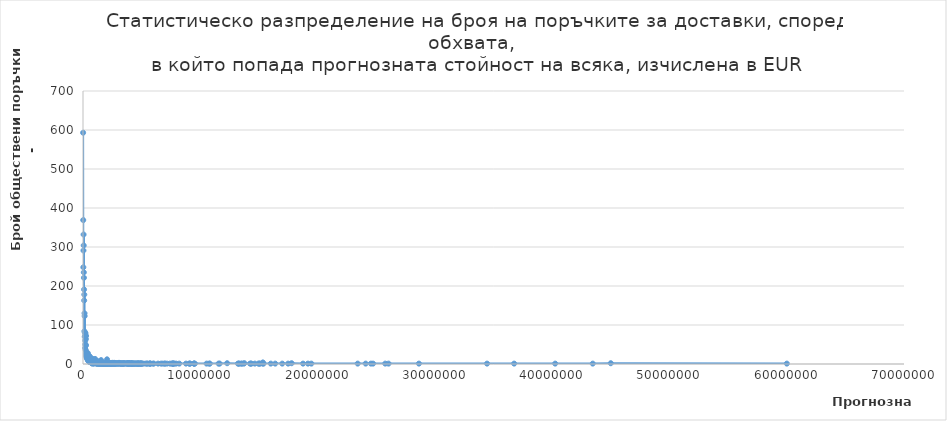
| Category | Series 0 |
|---|---|
| 10000.0 | 593 |
| 20000.0 | 369 |
| 30000.0 | 248 |
| 40000.0 | 291 |
| 50000.0 | 332 |
| 60000.0 | 304 |
| 70000.0 | 235 |
| 80000.0 | 221 |
| 90000.0 | 191 |
| 100000.0 | 163 |
| 110000.0 | 178 |
| 120000.0 | 84 |
| 130000.0 | 130 |
| 140000.0 | 123 |
| 150000.0 | 70 |
| 160000.0 | 80 |
| 170000.0 | 72 |
| 180000.0 | 41 |
| 190000.0 | 60 |
| 200000.0 | 51 |
| 210000.0 | 79 |
| 220000.0 | 48 |
| 230000.0 | 36 |
| 240000.0 | 64 |
| 250000.0 | 48 |
| 260000.0 | 72 |
| 270000.0 | 30 |
| 280000.0 | 22 |
| 290000.0 | 25 |
| 300000.0 | 17 |
| 310000.0 | 27 |
| 320000.0 | 18 |
| 330000.0 | 19 |
| 340000.0 | 20 |
| 350000.0 | 13 |
| 360000.0 | 27 |
| 370000.0 | 15 |
| 380000.0 | 17 |
| 390000.0 | 20 |
| 400000.0 | 15 |
| 410000.0 | 28 |
| 420000.0 | 18 |
| 430000.0 | 17 |
| 440000.0 | 17 |
| 450000.0 | 8 |
| 460000.0 | 8 |
| 470000.0 | 11 |
| 480000.0 | 8 |
| 490000.0 | 9 |
| 500000.0 | 10 |
| 510000.0 | 11 |
| 520000.0 | 17 |
| 530000.0 | 8 |
| 540000.0 | 12 |
| 550000.0 | 8 |
| 560000.0 | 5 |
| 570000.0 | 20 |
| 580000.0 | 6 |
| 590000.0 | 8 |
| 600000.0 | 5 |
| 610000.0 | 6 |
| 620000.0 | 11 |
| 630000.0 | 6 |
| 640000.0 | 10 |
| 650000.0 | 5 |
| 660000.0 | 5 |
| 670000.0 | 7 |
| 680000.0 | 5 |
| 690000.0 | 4 |
| 700000.0 | 10 |
| 710000.0 | 11 |
| 720000.0 | 7 |
| 730000.0 | 9 |
| 740000.0 | 2 |
| 750000.0 | 6 |
| 760000.0 | 4 |
| 770000.0 | 14 |
| 780000.0 | 4 |
| 790000.0 | 4 |
| 800000.0 | 12 |
| 810000.0 | 1 |
| 820000.0 | 5 |
| 830000.0 | 3 |
| 840000.0 | 6 |
| 850000.0 | 5 |
| 860000.0 | 4 |
| 870000.0 | 4 |
| 880000.0 | 2 |
| 890000.0 | 5 |
| 900000.0 | 6 |
| 910000.0 | 3 |
| 920000.0 | 1 |
| 930000.0 | 8 |
| 940000.0 | 4 |
| 950000.0 | 4 |
| 960000.0 | 3 |
| 970000.0 | 3 |
| 980000.0 | 5 |
| 990000.0 | 4 |
| 1000000.0 | 5 |
| 1010000.0 | 3 |
| 1020000.0 | 2 |
| 1030000.0 | 13 |
| 1040000.0 | 4 |
| 1060000.0 | 3 |
| 1070000.0 | 3 |
| 1080000.0 | 4 |
| 1090000.0 | 2 |
| 1100000.0 | 2 |
| 1110000.0 | 2 |
| 1120000.0 | 3 |
| 1130000.0 | 3 |
| 1140000.0 | 2 |
| 1150000.0 | 3 |
| 1160000.0 | 5 |
| 1190000.0 | 1 |
| 1200000.0 | 4 |
| 1210000.0 | 2 |
| 1220000.0 | 2 |
| 1230000.0 | 3 |
| 1240000.0 | 1 |
| 1250000.0 | 1 |
| 1270000.0 | 2 |
| 1280000.0 | 7 |
| 1290000.0 | 4 |
| 1310000.0 | 3 |
| 1330000.0 | 4 |
| 1340000.0 | 4 |
| 1350000.0 | 1 |
| 1360000.0 | 1 |
| 1390000.0 | 3 |
| 1400000.0 | 1 |
| 1410000.0 | 2 |
| 1420000.0 | 1 |
| 1440000.0 | 2 |
| 1450000.0 | 3 |
| 1470000.0 | 1 |
| 1490000.0 | 2 |
| 1500000.0 | 3 |
| 1510000.0 | 4 |
| 1520000.0 | 1 |
| 1540000.0 | 10 |
| 1560000.0 | 1 |
| 1580000.0 | 1 |
| 1590000.0 | 3 |
| 1600000.0 | 2 |
| 1610000.0 | 1 |
| 1630000.0 | 2 |
| 1650000.0 | 1 |
| 1660000.0 | 2 |
| 1670000.0 | 2 |
| 1680000.0 | 1 |
| 1690000.0 | 1 |
| 1700000.0 | 2 |
| 1720000.0 | 1 |
| 1730000.0 | 1 |
| 1740000.0 | 1 |
| 1760000.0 | 1 |
| 1770000.0 | 3 |
| 1780000.0 | 1 |
| 1810000.0 | 2 |
| 1820000.0 | 2 |
| 1840000.0 | 1 |
| 1850000.0 | 2 |
| 1860000.0 | 2 |
| 1880000.0 | 1 |
| 1890000.0 | 1 |
| 1900000.0 | 1 |
| 1910000.0 | 1 |
| 1920000.0 | 2 |
| 1970000.0 | 2 |
| 2000000.0 | 1 |
| 2010000.0 | 1 |
| 2040000.0 | 3 |
| 2050000.0 | 12 |
| 2060000.0 | 1 |
| 2070000.0 | 1 |
| 2080000.0 | 1 |
| 2100000.0 | 1 |
| 2120000.0 | 1 |
| 2140000.0 | 3 |
| 2180000.0 | 3 |
| 2200000.0 | 2 |
| 2220000.0 | 1 |
| 2240000.0 | 1 |
| 2260000.0 | 2 |
| 2280000.0 | 1 |
| 2290000.0 | 1 |
| 2310000.0 | 2 |
| 2320000.0 | 1 |
| 2340000.0 | 2 |
| 2360000.0 | 1 |
| 2380000.0 | 1 |
| 2390000.0 | 1 |
| 2400000.0 | 1 |
| 2420000.0 | 1 |
| 2430000.0 | 1 |
| 2460000.0 | 1 |
| 2470000.0 | 1 |
| 2490000.0 | 1 |
| 2500000.0 | 3 |
| 2560000.0 | 2 |
| 2570000.0 | 1 |
| 2580000.0 | 1 |
| 2590000.0 | 2 |
| 2600000.0 | 1 |
| 2620000.0 | 1 |
| 2660000.0 | 3 |
| 2670000.0 | 2 |
| 2690000.0 | 1 |
| 2700000.0 | 1 |
| 2750000.0 | 1 |
| 2770000.0 | 1 |
| 2820000.0 | 2 |
| 2840000.0 | 1 |
| 2860000.0 | 1 |
| 2930000.0 | 2 |
| 2970000.0 | 1 |
| 2980000.0 | 1 |
| 3070000.0 | 3 |
| 3080000.0 | 1 |
| 3110000.0 | 1 |
| 3180000.0 | 2 |
| 3210000.0 | 1 |
| 3230000.0 | 1 |
| 3240000.0 | 1 |
| 3260000.0 | 1 |
| 3300000.0 | 1 |
| 3320000.0 | 1 |
| 3330000.0 | 1 |
| 3390000.0 | 1 |
| 3400000.0 | 1 |
| 3410000.0 | 1 |
| 3420000.0 | 1 |
| 3470000.0 | 1 |
| 3480000.0 | 2 |
| 3490000.0 | 1 |
| 3530000.0 | 1 |
| 3600000.0 | 2 |
| 3690000.0 | 1 |
| 3720000.0 | 1 |
| 3760000.0 | 2 |
| 3800000.0 | 1 |
| 3820000.0 | 1 |
| 3840000.0 | 1 |
| 3860000.0 | 1 |
| 3870000.0 | 2 |
| 3900000.0 | 2 |
| 3910000.0 | 1 |
| 3920000.0 | 1 |
| 3950000.0 | 1 |
| 4000000.0 | 1 |
| 4040000.0 | 1 |
| 4060000.0 | 2 |
| 4120000.0 | 1 |
| 4130000.0 | 1 |
| 4140000.0 | 1 |
| 4160000.0 | 1 |
| 4170000.0 | 1 |
| 4180000.0 | 1 |
| 4200000.0 | 1 |
| 4210000.0 | 1 |
| 4280000.0 | 1 |
| 4320000.0 | 1 |
| 4330000.0 | 1 |
| 4350000.0 | 1 |
| 4410000.0 | 1 |
| 4490000.0 | 1 |
| 4500000.0 | 1 |
| 4510000.0 | 1 |
| 4610000.0 | 1 |
| 4640000.0 | 1 |
| 4670000.0 | 1 |
| 4690000.0 | 1 |
| 4700000.0 | 1 |
| 4740000.0 | 1 |
| 4760000.0 | 1 |
| 4820000.0 | 1 |
| 4860000.0 | 1 |
| 4890000.0 | 1 |
| 4930000.0 | 1 |
| 4950000.0 | 1 |
| 4960000.0 | 1 |
| 4990000.0 | 1 |
| 5050000.0 | 1 |
| 5120000.0 | 1 |
| 5320000.0 | 1 |
| 5450000.0 | 1 |
| 5490000.0 | 1 |
| 5670000.0 | 1 |
| 5700000.0 | 1 |
| 5730000.0 | 1 |
| 5760000.0 | 1 |
| 5970000.0 | 1 |
| 6040000.0 | 1 |
| 6400000.0 | 1 |
| 6650000.0 | 1 |
| 6790000.0 | 1 |
| 6970000.0 | 1 |
| 6980000.0 | 1 |
| 7160000.0 | 1 |
| 7410000.0 | 1 |
| 7570000.0 | 1 |
| 7620000.0 | 1 |
| 7670000.0 | 1 |
| 7680000.0 | 1 |
| 7740000.0 | 1 |
| 7780000.0 | 1 |
| 7940000.0 | 1 |
| 8210000.0 | 1 |
| 8780000.0 | 1 |
| 9050000.0 | 1 |
| 9110000.0 | 1 |
| 9130000.0 | 1 |
| 9460000.0 | 1 |
| 9470000.0 | 1 |
| 9480000.0 | 1 |
| 9540000.0 | 1 |
| 10540000.0 | 1 |
| 10770000.0 | 1 |
| 10810000.0 | 1 |
| 11560000.0 | 1 |
| 11650000.0 | 1 |
| 12290000.0 | 2 |
| 13210000.0 | 1 |
| 13280000.0 | 1 |
| 13300000.0 | 1 |
| 13480000.0 | 1 |
| 13540000.0 | 1 |
| 13690000.0 | 1 |
| 13760000.0 | 2 |
| 14240000.0 | 1 |
| 14320000.0 | 1 |
| 14350000.0 | 1 |
| 14650000.0 | 1 |
| 14950000.0 | 1 |
| 15050000.0 | 1 |
| 15060000.0 | 1 |
| 15320000.0 | 1 |
| 15340000.0 | 4 |
| 15390000.0 | 1 |
| 16010000.0 | 1 |
| 16390000.0 | 1 |
| 16990000.0 | 1 |
| 17490000.0 | 1 |
| 17790000.0 | 2 |
| 18760000.0 | 1 |
| 19180000.0 | 1 |
| 19470000.0 | 1 |
| 23420000.0 | 1 |
| 24100000.0 | 1 |
| 24550000.0 | 1 |
| 24730000.0 | 1 |
| 25770000.0 | 1 |
| 26050000.0 | 1 |
| 28640000.0 | 1 |
| 34450000.0 | 1 |
| 36760000.0 | 1 |
| 40260000.0 | 1 |
| 43460000.0 | 1 |
| 45000000.0 | 2 |
| 60010000.0 | 1 |